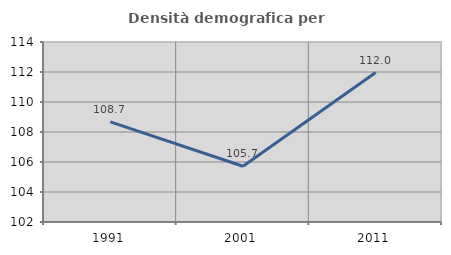
| Category | Densità demografica |
|---|---|
| 1991.0 | 108.679 |
| 2001.0 | 105.714 |
| 2011.0 | 111.966 |